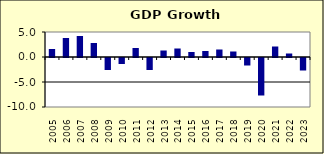
| Category | 1.8 |
|---|---|
| 2005.0 | 1.6 |
| 2006.0 | 3.8 |
| 2007.0 | 4.2 |
| 2008.0 | 2.8 |
| 2009.0 | -2.4 |
| 2010.0 | -1.2 |
| 2011.0 | 1.8 |
| 2012.0 | -2.4 |
| 2013.0 | 1.3 |
| 2014.0 | 1.7 |
| 2015.0 | 1 |
| 2016.0 | 1.2 |
| 2017.0 | 1.5 |
| 2018.0 | 1.1 |
| 2019.0 | -1.5 |
| 2020.0 | -7.5 |
| 2021.0 | 2.1 |
| 2022.0 | 0.7 |
| 2023.0 | -2.5 |